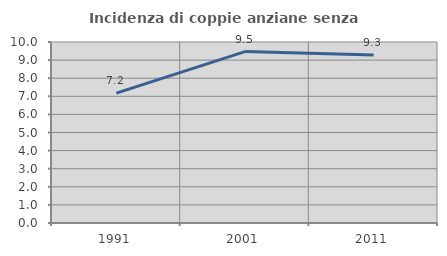
| Category | Incidenza di coppie anziane senza figli  |
|---|---|
| 1991.0 | 7.179 |
| 2001.0 | 9.47 |
| 2011.0 | 9.288 |